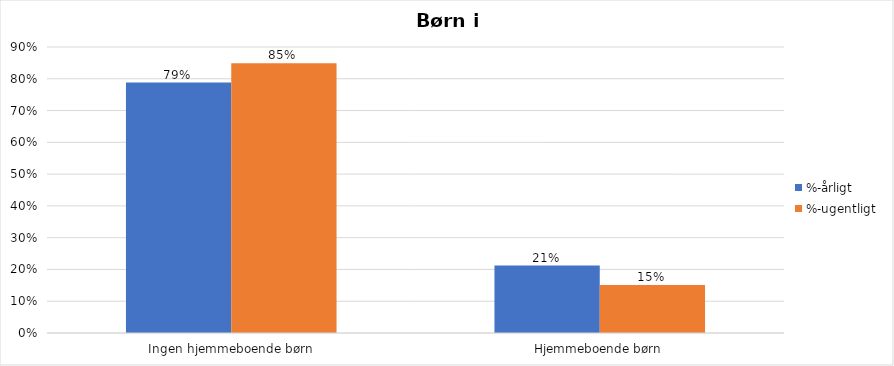
| Category | %-årligt | %-ugentligt |
|---|---|---|
| Ingen hjemmeboende børn | 0.788 | 0.849 |
| Hjemmeboende børn | 0.212 | 0.151 |